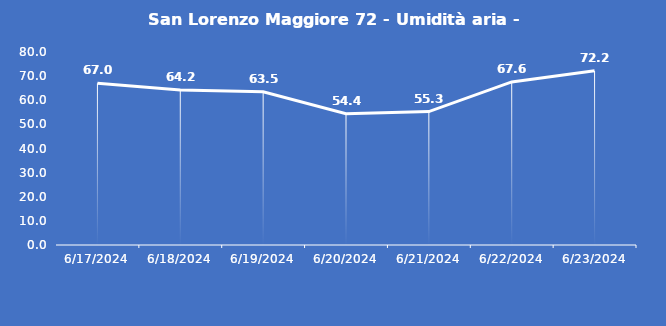
| Category | San Lorenzo Maggiore 72 - Umidità aria - Grezzo (%) |
|---|---|
| 6/17/24 | 67 |
| 6/18/24 | 64.2 |
| 6/19/24 | 63.5 |
| 6/20/24 | 54.4 |
| 6/21/24 | 55.3 |
| 6/22/24 | 67.6 |
| 6/23/24 | 72.2 |